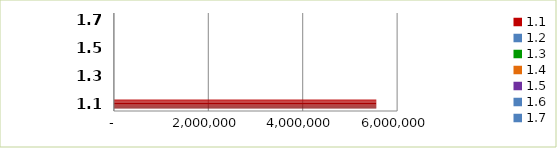
| Category | Series 0 |
|---|---|
| 1.1 | 5558944.118 |
| 1.2 | 0 |
| 1.3 | 0 |
| 1.4 | 0 |
| 1.5 | 0 |
| 1.6 | 0 |
| 1.7 | 0 |